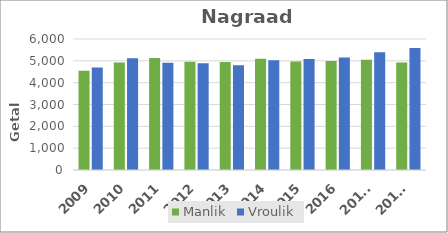
| Category | Manlik | Vroulik |
|---|---|---|
| 2009 | 4542 | 4691 |
| 2010 | 4919 | 5124 |
| 2011 | 5129 | 4914 |
| 2012 | 4963 | 4890 |
| 2013 | 4951 | 4802 |
| 2014 | 5095 | 5024 |
| 2015 | 4965 | 5086 |
| 2016 | 4996 | 5158 |
| 2017* | 5046 | 5393 |
| 2018* | 4919 | 5585 |